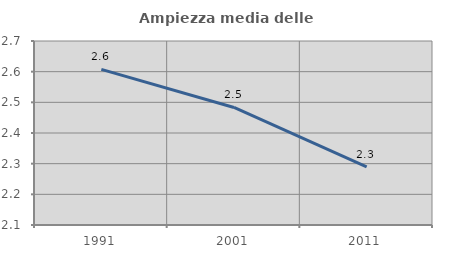
| Category | Ampiezza media delle famiglie |
|---|---|
| 1991.0 | 2.607 |
| 2001.0 | 2.483 |
| 2011.0 | 2.29 |